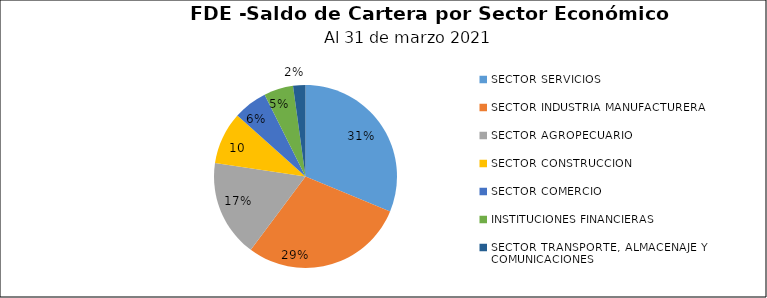
| Category | Saldo | Créditos |
|---|---|---|
| SECTOR SERVICIOS | 18.743 | 240 |
| SECTOR INDUSTRIA MANUFACTURERA | 17.387 | 223 |
| SECTOR AGROPECUARIO | 10.296 | 100 |
| SECTOR CONSTRUCCION | 5.565 | 22 |
| SECTOR COMERCIO | 3.604 | 183 |
| INSTITUCIONES FINANCIERAS | 3.114 | 6 |
| SECTOR TRANSPORTE, ALMACENAJE Y COMUNICACIONES | 1.31 | 5 |